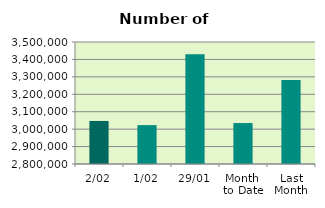
| Category | Series 0 |
|---|---|
| 2/02 | 3046926 |
| 1/02 | 3023170 |
| 29/01 | 3429148 |
| Month 
to Date | 3035048 |
| Last
Month | 3281385.4 |